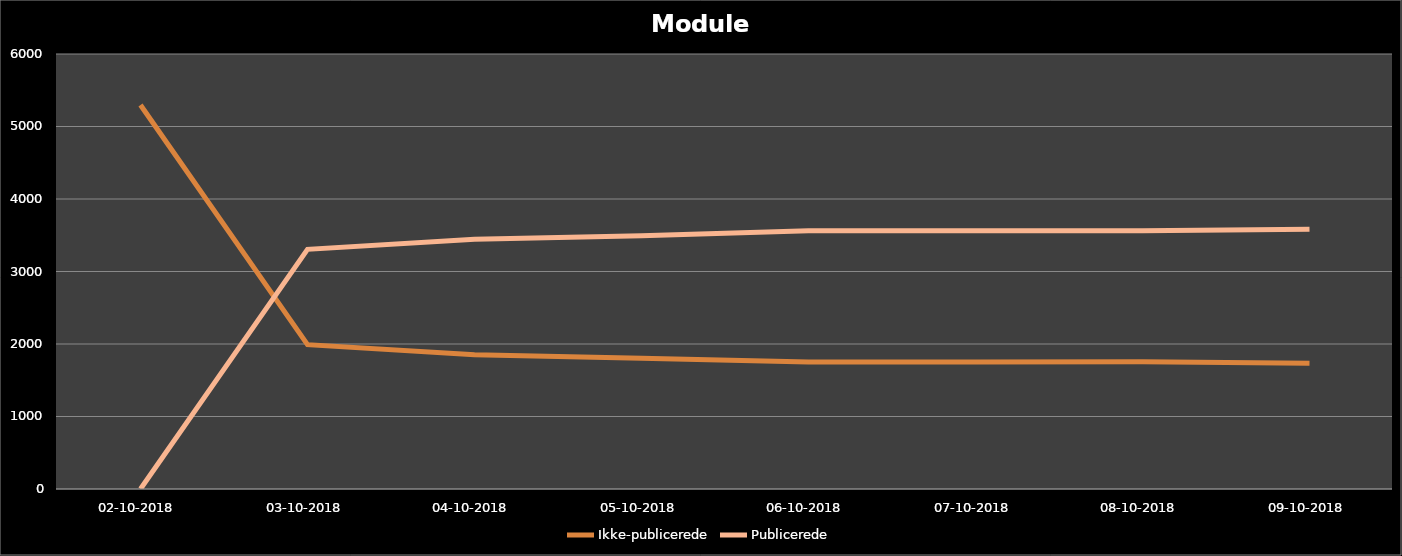
| Category | Ikke-publicerede | Publicerede |
|---|---|---|
| 02-10-2018 | 5297 | 0 |
| 03-10-2018 | 1991 | 3306 |
| 04-10-2018 | 1851 | 3446 |
| 05-10-2018 | 1805 | 3492 |
| 06-10-2018 | 1751 | 3561 |
| 07-10-2018 | 1751 | 3561 |
| 08-10-2018 | 1755 | 3561 |
| 09-10-2018 | 1733 | 3583 |